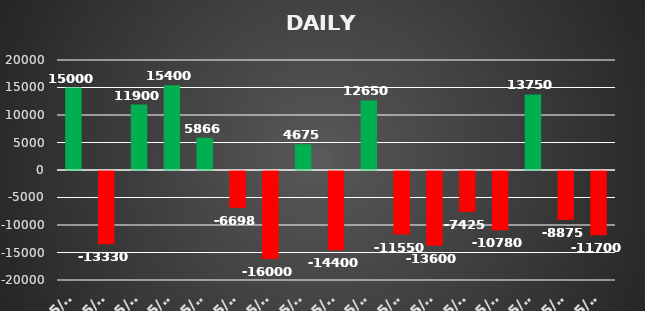
| Category | Series 0 |
|---|---|
| 2022-05-02 | 15000 |
| 2022-05-04 | -13330 |
| 2022-05-05 | 11900 |
| 2022-05-06 | 15400 |
| 2022-05-09 | 5866.3 |
| 2022-05-10 | -6697.5 |
| 2022-05-12 | -16000 |
| 2022-05-13 | 4675 |
| 2022-05-16 | -14400 |
| 2022-05-17 | 12650 |
| 2022-05-18 | -11550 |
| 2022-05-19 | -13600 |
| 2022-05-23 | -7425 |
| 2022-05-24 | -10780 |
| 2022-05-26 | 13750 |
| 2022-05-27 | -8875 |
| 2022-05-31 | -11700 |